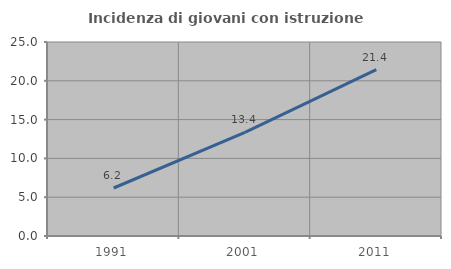
| Category | Incidenza di giovani con istruzione universitaria |
|---|---|
| 1991.0 | 6.186 |
| 2001.0 | 13.352 |
| 2011.0 | 21.449 |